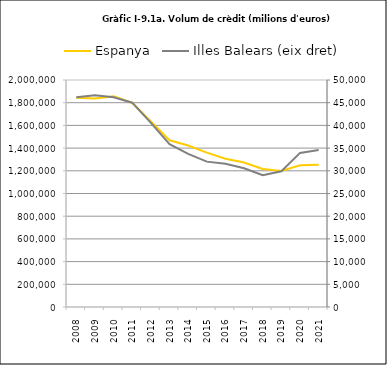
| Category | Espanya |
|---|---|
| 2008.0 | 1842796.737 |
| 2009.0 | 1837760.758 |
| 2010.0 | 1856783.279 |
| 2011.0 | 1798025.738 |
| 2012.0 | 1634654.878 |
| 2013.0 | 1469010.399 |
| 2014.0 | 1422890.271 |
| 2015.0 | 1360361.127 |
| 2016.0 | 1306395.858 |
| 2017.0 | 1273445.999 |
| 2018.0 | 1215969.747 |
| 2019.0 | 1199375.206 |
| 2020.0 | 1249300.979 |
| 2021.0 | 1252354.012 |